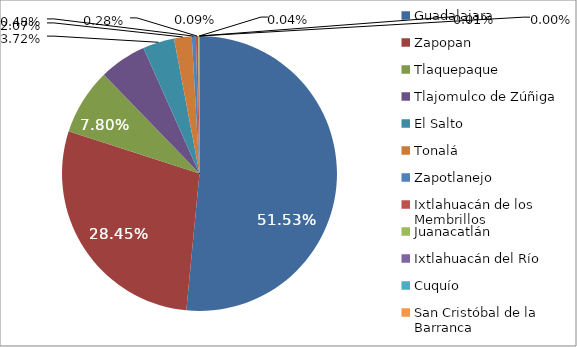
| Category | Series 0 |
|---|---|
| Guadalajara | 693325 |
| Zapopan | 382754 |
| Tlaquepaque | 104913 |
| Tlajomulco de Zúñiga | 74556 |
| El Salto | 50022 |
| Tonalá | 27858 |
| Zapotlanejo | 6411 |
| Ixtlahuacán de los Membrillos | 3739 |
| Juanacatlán | 1158 |
| Ixtlahuacán del Río | 593 |
| Cuquío | 180 |
| San Cristóbal de la Barranca | 19 |